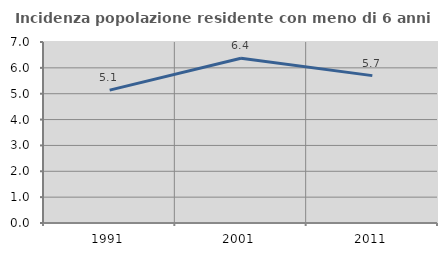
| Category | Incidenza popolazione residente con meno di 6 anni |
|---|---|
| 1991.0 | 5.14 |
| 2001.0 | 6.373 |
| 2011.0 | 5.699 |